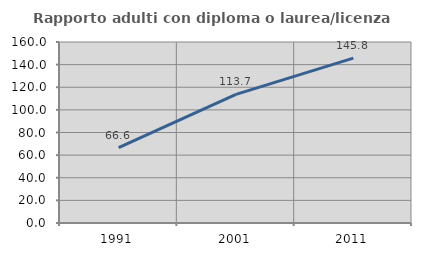
| Category | Rapporto adulti con diploma o laurea/licenza media  |
|---|---|
| 1991.0 | 66.642 |
| 2001.0 | 113.737 |
| 2011.0 | 145.75 |